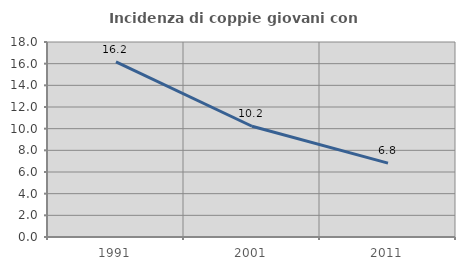
| Category | Incidenza di coppie giovani con figli |
|---|---|
| 1991.0 | 16.169 |
| 2001.0 | 10.222 |
| 2011.0 | 6.823 |